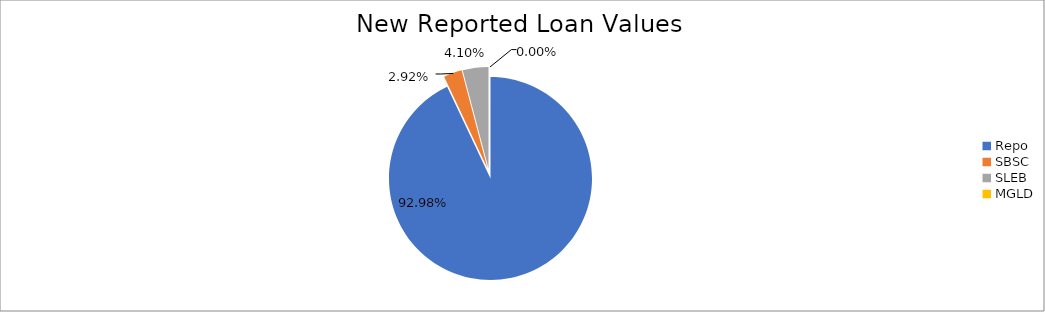
| Category | Series 0 |
|---|---|
| Repo | 9326121.544 |
| SBSC | 293134.297 |
| SLEB | 410899.314 |
| MGLD | 474.029 |